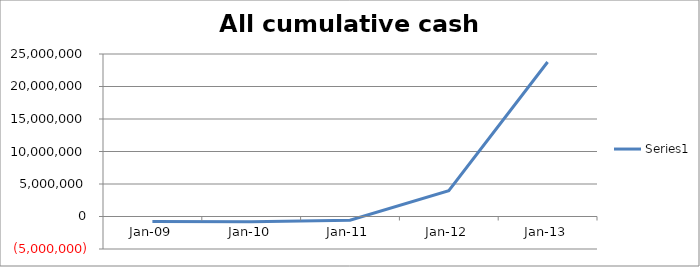
| Category | Series 0 |
|---|---|
| 2009-12-31 | -779418 |
| 2010-12-31 | -795200.101 |
| 2011-12-31 | -573898.984 |
| 2012-12-30 | 3983981.663 |
| 2013-12-30 | 23769592.37 |